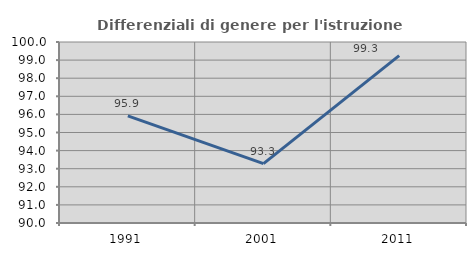
| Category | Differenziali di genere per l'istruzione superiore |
|---|---|
| 1991.0 | 95.92 |
| 2001.0 | 93.279 |
| 2011.0 | 99.251 |